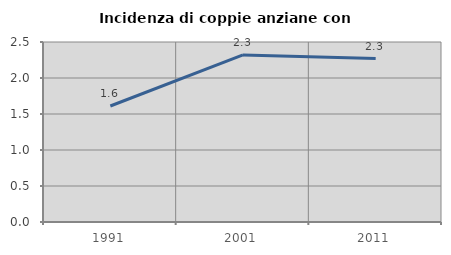
| Category | Incidenza di coppie anziane con figli |
|---|---|
| 1991.0 | 1.611 |
| 2001.0 | 2.321 |
| 2011.0 | 2.269 |